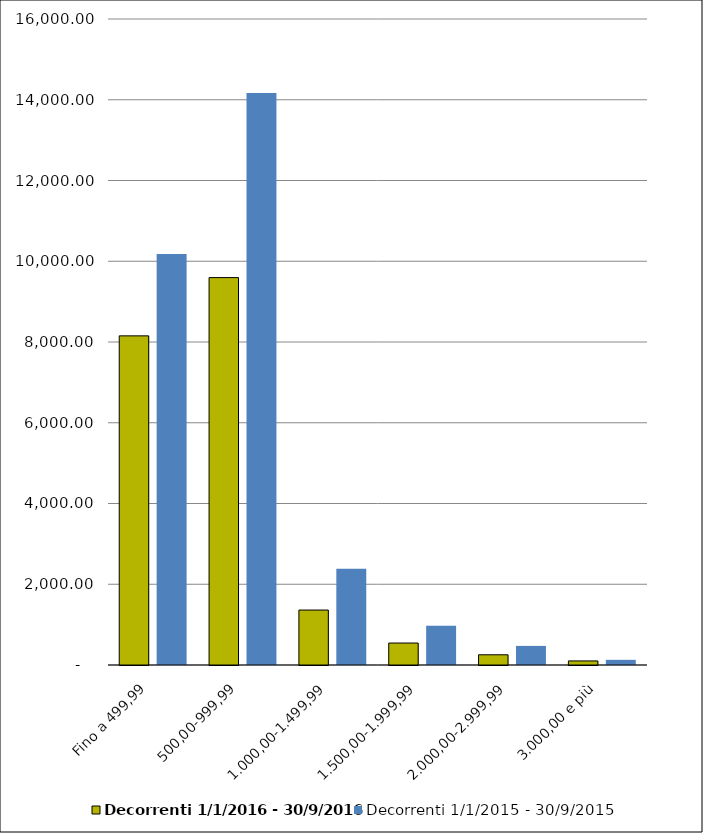
| Category | Decorrenti 1/1/2016 - 30/9/2016 | Decorrenti 1/1/2015 - 30/9/2015 |
|---|---|---|
| Fino a 499,99 | 8152 | 10182 |
| 500,00-999,99 | 9595 | 14165 |
| 1.000,00-1.499,99 | 1361 | 2381 |
| 1.500,00-1.999,99 | 544 | 975 |
| 2.000,00-2.999,99 | 253 | 473 |
| 3.000,00 e più | 101 | 128 |